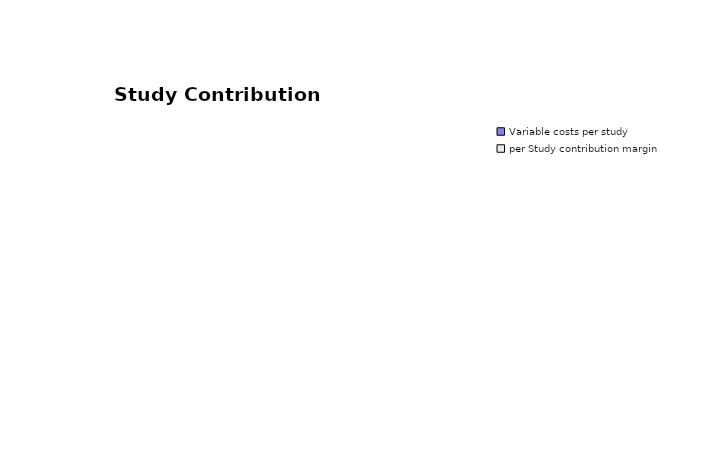
| Category | Series 0 |
|---|---|
| Variable costs per study | 0 |
| per Study contribution margin | 0 |